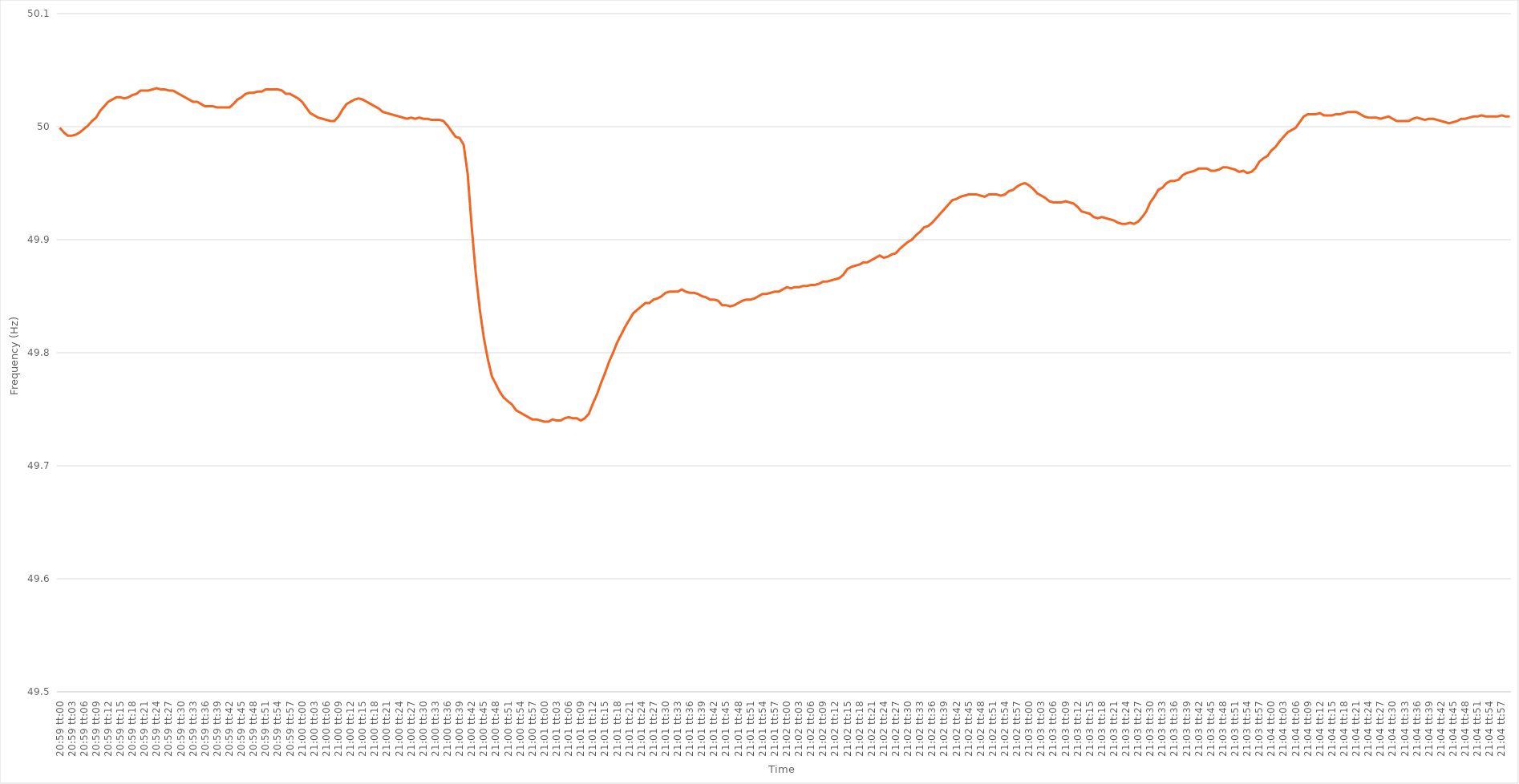
| Category | Series 0 |
|---|---|
| 0.8743055555555556 | 49.999 |
| 0.8743171296296296 | 49.995 |
| 0.8743287037037036 | 49.992 |
| 0.8743402777777778 | 49.992 |
| 0.8743518518518519 | 49.993 |
| 0.8743634259259259 | 49.995 |
| 0.874375 | 49.998 |
| 0.874386574074074 | 50.001 |
| 0.8743981481481482 | 50.005 |
| 0.8744097222222221 | 50.008 |
| 0.8744212962962963 | 50.014 |
| 0.8744328703703704 | 50.018 |
| 0.8744444444444445 | 50.022 |
| 0.8744560185185185 | 50.024 |
| 0.8744675925925925 | 50.026 |
| 0.8744791666666667 | 50.026 |
| 0.8744907407407408 | 50.025 |
| 0.8745023148148148 | 50.026 |
| 0.8745138888888889 | 50.028 |
| 0.874525462962963 | 50.029 |
| 0.874537037037037 | 50.032 |
| 0.874548611111111 | 50.032 |
| 0.8745601851851852 | 50.032 |
| 0.8745717592592593 | 50.033 |
| 0.8745833333333333 | 50.034 |
| 0.8745949074074074 | 50.033 |
| 0.8746064814814815 | 50.033 |
| 0.8746180555555556 | 50.032 |
| 0.8746296296296295 | 50.032 |
| 0.8746412037037037 | 50.03 |
| 0.8746527777777778 | 50.028 |
| 0.8746643518518519 | 50.026 |
| 0.8746759259259259 | 50.024 |
| 0.8746875 | 50.022 |
| 0.8746990740740741 | 50.022 |
| 0.8747106481481483 | 50.02 |
| 0.8747222222222222 | 50.018 |
| 0.8747337962962963 | 50.018 |
| 0.8747453703703704 | 50.018 |
| 0.8747569444444444 | 50.017 |
| 0.8747685185185184 | 50.017 |
| 0.8747800925925926 | 50.017 |
| 0.8747916666666667 | 50.017 |
| 0.8748032407407407 | 50.02 |
| 0.8748148148148148 | 50.024 |
| 0.8748263888888889 | 50.026 |
| 0.874837962962963 | 50.029 |
| 0.8748495370370369 | 50.03 |
| 0.8748611111111111 | 50.03 |
| 0.8748726851851852 | 50.031 |
| 0.8748842592592593 | 50.031 |
| 0.8748958333333333 | 50.033 |
| 0.8749074074074074 | 50.033 |
| 0.8749189814814815 | 50.033 |
| 0.8749305555555557 | 50.033 |
| 0.8749421296296296 | 50.032 |
| 0.8749537037037037 | 50.029 |
| 0.8749652777777778 | 50.029 |
| 0.8749768518518519 | 50.027 |
| 0.8749884259259259 | 50.025 |
| 0.875 | 50.022 |
| 0.8750115740740741 | 50.017 |
| 0.8750231481481481 | 50.012 |
| 0.8750347222222222 | 50.01 |
| 0.8750462962962963 | 50.008 |
| 0.8750578703703704 | 50.007 |
| 0.8750694444444443 | 50.006 |
| 0.8750810185185185 | 50.005 |
| 0.8750925925925926 | 50.005 |
| 0.8751041666666667 | 50.009 |
| 0.8751157407407407 | 50.015 |
| 0.8751273148148148 | 50.02 |
| 0.8751388888888889 | 50.022 |
| 0.8751504629629631 | 50.024 |
| 0.875162037037037 | 50.025 |
| 0.8751736111111111 | 50.024 |
| 0.8751851851851852 | 50.022 |
| 0.8751967592592593 | 50.02 |
| 0.8752083333333333 | 50.018 |
| 0.8752199074074074 | 50.016 |
| 0.8752314814814816 | 50.013 |
| 0.8752430555555555 | 50.012 |
| 0.8752546296296296 | 50.011 |
| 0.8752662037037037 | 50.01 |
| 0.8752777777777778 | 50.009 |
| 0.8752893518518517 | 50.008 |
| 0.8753009259259259 | 50.007 |
| 0.8753125 | 50.008 |
| 0.8753240740740741 | 50.007 |
| 0.8753356481481481 | 50.008 |
| 0.8753472222222222 | 50.007 |
| 0.8753587962962963 | 50.007 |
| 0.8753703703703705 | 50.006 |
| 0.8753819444444444 | 50.006 |
| 0.8753935185185185 | 50.006 |
| 0.8754050925925926 | 50.005 |
| 0.8754166666666667 | 50.001 |
| 0.8754282407407407 | 49.996 |
| 0.8754398148148148 | 49.991 |
| 0.875451388888889 | 49.99 |
| 0.875462962962963 | 49.984 |
| 0.875474537037037 | 49.958 |
| 0.8754861111111111 | 49.911 |
| 0.8754976851851852 | 49.87 |
| 0.8755092592592592 | 49.838 |
| 0.8755208333333333 | 49.813 |
| 0.8755324074074075 | 49.794 |
| 0.8755439814814815 | 49.779 |
| 0.8755555555555555 | 49.772 |
| 0.8755671296296296 | 49.765 |
| 0.8755787037037037 | 49.76 |
| 0.8755902777777779 | 49.757 |
| 0.8756018518518518 | 49.754 |
| 0.875613425925926 | 49.749 |
| 0.875625 | 49.747 |
| 0.8756365740740741 | 49.745 |
| 0.8756481481481481 | 49.743 |
| 0.8756597222222222 | 49.741 |
| 0.8756712962962964 | 49.741 |
| 0.8756828703703704 | 49.74 |
| 0.8756944444444444 | 49.739 |
| 0.8757060185185185 | 49.739 |
| 0.8757175925925926 | 49.741 |
| 0.8757291666666666 | 49.74 |
| 0.8757407407407407 | 49.74 |
| 0.8757523148148149 | 49.742 |
| 0.8757638888888889 | 49.743 |
| 0.8757754629629629 | 49.742 |
| 0.875787037037037 | 49.742 |
| 0.8757986111111111 | 49.74 |
| 0.8758101851851853 | 49.742 |
| 0.8758217592592592 | 49.746 |
| 0.8758333333333334 | 49.755 |
| 0.8758449074074074 | 49.763 |
| 0.8758564814814815 | 49.773 |
| 0.8758680555555555 | 49.782 |
| 0.8758796296296296 | 49.792 |
| 0.8758912037037038 | 49.8 |
| 0.8759027777777778 | 49.809 |
| 0.8759143518518518 | 49.816 |
| 0.8759259259259259 | 49.823 |
| 0.8759375 | 49.829 |
| 0.875949074074074 | 49.835 |
| 0.8759606481481481 | 49.838 |
| 0.8759722222222223 | 49.841 |
| 0.8759837962962963 | 49.844 |
| 0.8759953703703703 | 49.844 |
| 0.8760069444444444 | 49.847 |
| 0.8760185185185185 | 49.848 |
| 0.8760300925925927 | 49.85 |
| 0.8760416666666666 | 49.853 |
| 0.8760532407407408 | 49.854 |
| 0.8760648148148148 | 49.854 |
| 0.876076388888889 | 49.854 |
| 0.8760879629629629 | 49.856 |
| 0.876099537037037 | 49.854 |
| 0.8761111111111112 | 49.853 |
| 0.8761226851851852 | 49.853 |
| 0.8761342592592593 | 49.852 |
| 0.8761458333333333 | 49.85 |
| 0.8761574074074074 | 49.849 |
| 0.8761689814814816 | 49.847 |
| 0.8761805555555555 | 49.847 |
| 0.8761921296296297 | 49.846 |
| 0.8762037037037037 | 49.842 |
| 0.8762152777777777 | 49.842 |
| 0.8762268518518518 | 49.841 |
| 0.8762384259259259 | 49.842 |
| 0.8762500000000001 | 49.844 |
| 0.876261574074074 | 49.846 |
| 0.8762731481481482 | 49.847 |
| 0.8762847222222222 | 49.847 |
| 0.8762962962962964 | 49.848 |
| 0.8763078703703703 | 49.85 |
| 0.8763194444444444 | 49.852 |
| 0.8763310185185186 | 49.852 |
| 0.8763425925925926 | 49.853 |
| 0.8763541666666667 | 49.854 |
| 0.8763657407407407 | 49.854 |
| 0.8763773148148148 | 49.856 |
| 0.876388888888889 | 49.858 |
| 0.8764004629629629 | 49.857 |
| 0.8764120370370371 | 49.858 |
| 0.8764236111111111 | 49.858 |
| 0.8764351851851852 | 49.859 |
| 0.8764467592592592 | 49.859 |
| 0.8764583333333333 | 49.86 |
| 0.8764699074074075 | 49.86 |
| 0.8764814814814814 | 49.861 |
| 0.8764930555555556 | 49.863 |
| 0.8765046296296296 | 49.863 |
| 0.8765162037037038 | 49.864 |
| 0.8765277777777777 | 49.865 |
| 0.8765393518518518 | 49.866 |
| 0.876550925925926 | 49.869 |
| 0.8765625 | 49.874 |
| 0.8765740740740741 | 49.876 |
| 0.8765856481481481 | 49.877 |
| 0.8765972222222222 | 49.878 |
| 0.8766087962962964 | 49.88 |
| 0.8766203703703703 | 49.88 |
| 0.8766319444444445 | 49.882 |
| 0.8766435185185185 | 49.884 |
| 0.8766550925925927 | 49.886 |
| 0.8766666666666666 | 49.884 |
| 0.8766782407407407 | 49.885 |
| 0.8766898148148149 | 49.887 |
| 0.8767013888888888 | 49.888 |
| 0.876712962962963 | 49.892 |
| 0.876724537037037 | 49.895 |
| 0.8767361111111112 | 49.898 |
| 0.8767476851851851 | 49.9 |
| 0.8767592592592592 | 49.904 |
| 0.8767708333333334 | 49.907 |
| 0.8767824074074074 | 49.911 |
| 0.8767939814814815 | 49.912 |
| 0.8768055555555555 | 49.915 |
| 0.8768171296296297 | 49.919 |
| 0.8768287037037038 | 49.923 |
| 0.8768402777777777 | 49.927 |
| 0.8768518518518519 | 49.931 |
| 0.8768634259259259 | 49.935 |
| 0.8768750000000001 | 49.936 |
| 0.876886574074074 | 49.938 |
| 0.8768981481481481 | 49.939 |
| 0.8769097222222223 | 49.94 |
| 0.8769212962962962 | 49.94 |
| 0.8769328703703704 | 49.94 |
| 0.8769444444444444 | 49.939 |
| 0.8769560185185186 | 49.938 |
| 0.8769675925925925 | 49.94 |
| 0.8769791666666666 | 49.94 |
| 0.8769907407407408 | 49.94 |
| 0.8770023148148148 | 49.939 |
| 0.8770138888888889 | 49.94 |
| 0.8770254629629629 | 49.943 |
| 0.8770370370370371 | 49.944 |
| 0.8770486111111112 | 49.947 |
| 0.8770601851851851 | 49.949 |
| 0.8770717592592593 | 49.95 |
| 0.8770833333333333 | 49.948 |
| 0.8770949074074075 | 49.945 |
| 0.8771064814814814 | 49.941 |
| 0.8771180555555556 | 49.939 |
| 0.8771296296296297 | 49.937 |
| 0.8771412037037036 | 49.934 |
| 0.8771527777777778 | 49.933 |
| 0.8771643518518518 | 49.933 |
| 0.877175925925926 | 49.933 |
| 0.8771874999999999 | 49.934 |
| 0.877199074074074 | 49.933 |
| 0.8772106481481482 | 49.932 |
| 0.8772222222222222 | 49.929 |
| 0.8772337962962963 | 49.925 |
| 0.8772453703703703 | 49.924 |
| 0.8772569444444445 | 49.923 |
| 0.8772685185185186 | 49.92 |
| 0.8772800925925925 | 49.919 |
| 0.8772916666666667 | 49.92 |
| 0.8773032407407407 | 49.919 |
| 0.8773148148148149 | 49.918 |
| 0.8773263888888888 | 49.917 |
| 0.877337962962963 | 49.915 |
| 0.8773495370370371 | 49.914 |
| 0.8773611111111111 | 49.914 |
| 0.8773726851851852 | 49.915 |
| 0.8773842592592592 | 49.914 |
| 0.8773958333333334 | 49.916 |
| 0.8774074074074073 | 49.92 |
| 0.8774189814814815 | 49.925 |
| 0.8774305555555556 | 49.933 |
| 0.8774421296296296 | 49.938 |
| 0.8774537037037037 | 49.944 |
| 0.8774652777777777 | 49.946 |
| 0.8774768518518519 | 49.95 |
| 0.877488425925926 | 49.952 |
| 0.8775 | 49.952 |
| 0.8775115740740741 | 49.953 |
| 0.8775231481481481 | 49.957 |
| 0.8775347222222223 | 49.959 |
| 0.8775462962962962 | 49.96 |
| 0.8775578703703704 | 49.961 |
| 0.8775694444444445 | 49.963 |
| 0.8775810185185186 | 49.963 |
| 0.8775925925925926 | 49.963 |
| 0.8776041666666666 | 49.961 |
| 0.8776157407407408 | 49.961 |
| 0.8776273148148147 | 49.962 |
| 0.8776388888888889 | 49.964 |
| 0.877650462962963 | 49.964 |
| 0.877662037037037 | 49.963 |
| 0.8776736111111111 | 49.962 |
| 0.8776851851851851 | 49.96 |
| 0.8776967592592593 | 49.961 |
| 0.8777083333333334 | 49.959 |
| 0.8777199074074074 | 49.96 |
| 0.8777314814814815 | 49.963 |
| 0.8777430555555555 | 49.969 |
| 0.8777546296296297 | 49.972 |
| 0.8777662037037036 | 49.974 |
| 0.8777777777777778 | 49.979 |
| 0.8777893518518519 | 49.982 |
| 0.877800925925926 | 49.987 |
| 0.8778125 | 49.991 |
| 0.877824074074074 | 49.995 |
| 0.8778356481481482 | 49.997 |
| 0.8778472222222221 | 49.999 |
| 0.8778587962962963 | 50.004 |
| 0.8778703703703704 | 50.009 |
| 0.8778819444444445 | 50.011 |
| 0.8778935185185185 | 50.011 |
| 0.8779050925925925 | 50.011 |
| 0.8779166666666667 | 50.012 |
| 0.8779282407407408 | 50.01 |
| 0.8779398148148148 | 50.01 |
| 0.8779513888888889 | 50.01 |
| 0.877962962962963 | 50.011 |
| 0.8779745370370371 | 50.011 |
| 0.877986111111111 | 50.012 |
| 0.8779976851851852 | 50.013 |
| 0.8780092592592593 | 50.013 |
| 0.8780208333333334 | 50.013 |
| 0.8780324074074074 | 50.011 |
| 0.8780439814814814 | 50.009 |
| 0.8780555555555556 | 50.008 |
| 0.8780671296296297 | 50.008 |
| 0.8780787037037037 | 50.008 |
| 0.8780902777777778 | 50.007 |
| 0.8781018518518519 | 50.008 |
| 0.8781134259259259 | 50.009 |
| 0.8781249999999999 | 50.007 |
| 0.8781365740740741 | 50.005 |
| 0.8781481481481482 | 50.005 |
| 0.8781597222222222 | 50.005 |
| 0.8781712962962963 | 50.005 |
| 0.8781828703703703 | 50.007 |
| 0.8781944444444445 | 50.008 |
| 0.8782060185185184 | 50.007 |
| 0.8782175925925926 | 50.006 |
| 0.8782291666666667 | 50.007 |
| 0.8782407407407408 | 50.007 |
| 0.8782523148148148 | 50.006 |
| 0.8782638888888888 | 50.005 |
| 0.878275462962963 | 50.004 |
| 0.8782870370370371 | 50.003 |
| 0.8782986111111111 | 50.004 |
| 0.8783101851851852 | 50.005 |
| 0.8783217592592593 | 50.007 |
| 0.8783333333333333 | 50.007 |
| 0.8783449074074073 | 50.008 |
| 0.8783564814814815 | 50.009 |
| 0.8783680555555556 | 50.009 |
| 0.8783796296296296 | 50.01 |
| 0.8783912037037037 | 50.009 |
| 0.8784027777777778 | 50.009 |
| 0.8784143518518519 | 50.009 |
| 0.8784259259259258 | 50.009 |
| 0.8784375 | 50.01 |
| 0.8784490740740741 | 50.009 |
| 0.8784606481481482 | 50.009 |